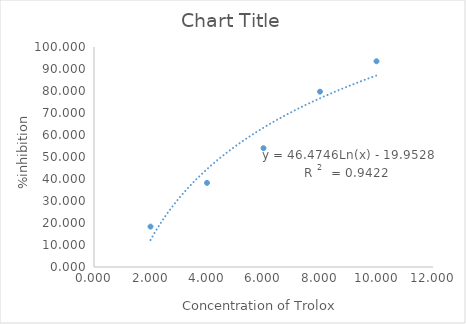
| Category | Series 0 |
|---|---|
| 2.0 | 18.359 |
| 4.0 | 38.229 |
| 6.0 | 53.996 |
| 8.0 | 79.698 |
| 10.0 | 93.521 |